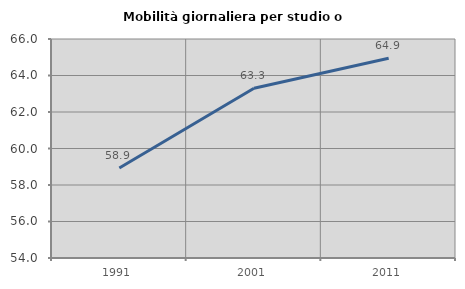
| Category | Mobilità giornaliera per studio o lavoro |
|---|---|
| 1991.0 | 58.929 |
| 2001.0 | 63.301 |
| 2011.0 | 64.944 |